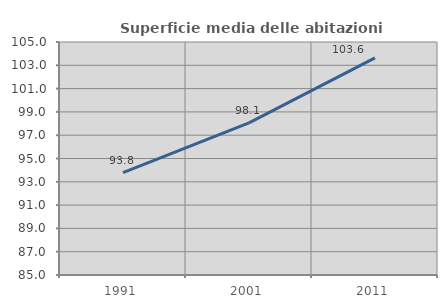
| Category | Superficie media delle abitazioni occupate |
|---|---|
| 1991.0 | 93.783 |
| 2001.0 | 98.055 |
| 2011.0 | 103.643 |